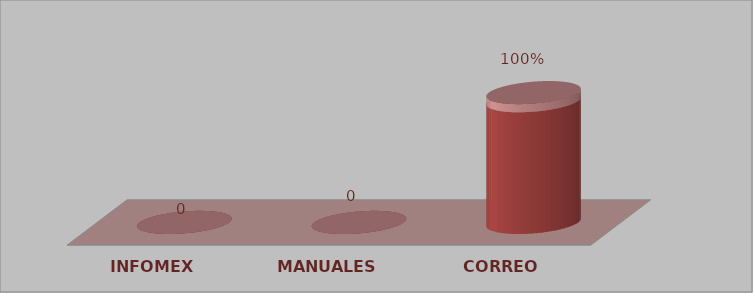
| Category | Series 0 | Series 1 |
|---|---|---|
| INFOMEX | 0 | 0 |
| MANUALES | 0 | 0 |
| CORREO | 15 | 1 |